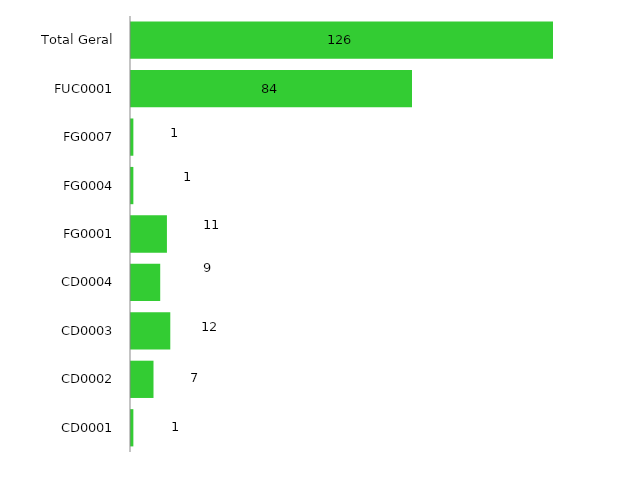
| Category | 2018 |
|---|---|
| CD0001 | 1 |
| CD0002 | 7 |
| CD0003 | 12 |
| CD0004 | 9 |
| FG0001 | 11 |
| FG0004 | 1 |
| FG0007 | 1 |
| FUC0001 | 84 |
| Total Geral | 126 |